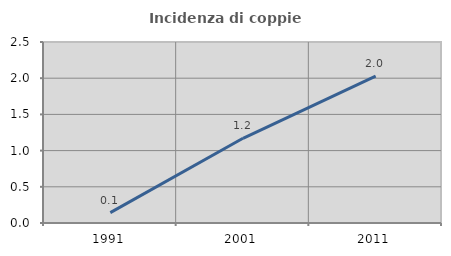
| Category | Incidenza di coppie miste |
|---|---|
| 1991.0 | 0.144 |
| 2001.0 | 1.17 |
| 2011.0 | 2.028 |